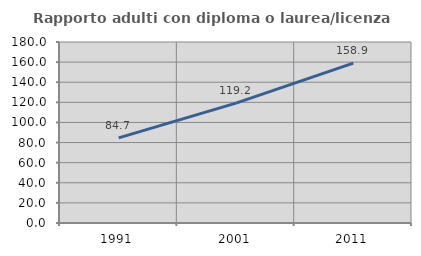
| Category | Rapporto adulti con diploma o laurea/licenza media  |
|---|---|
| 1991.0 | 84.683 |
| 2001.0 | 119.162 |
| 2011.0 | 158.92 |